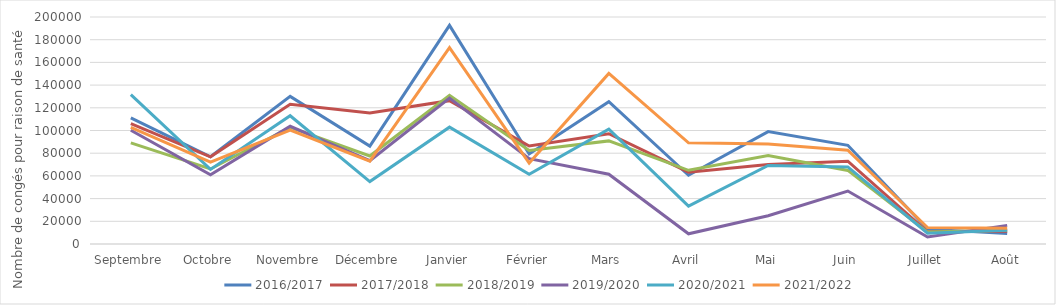
| Category | 2016/2017 | 2017/2018 | 2018/2019 | 2019/2020 | 2020/2021 | 2021/2022 |
|---|---|---|---|---|---|---|
| Septembre | 111199 | 106146 | 89077 | 100266 | 131608 | 102759 |
| Octobre | 76849 | 76831 | 66102 | 60899 | 65692 | 72157 |
| Novembre | 130060 | 123075 | 102812 | 103746 | 113022 | 100324 |
| Décembre | 86249 | 115398 | 77538 | 73438 | 55038 | 73012 |
| Janvier | 192656 | 126299 | 131051 | 128602 | 102952 | 173086 |
| Février | 79312 | 86326 | 82358 | 75176 | 61387 | 71261 |
| Mars | 125334 | 97158 | 90846 | 61443 | 101126 | 150284 |
| Avril | 60574 | 63251 | 64930 | 8985 | 33427 | 89103 |
| Mai | 99057 | 69996 | 77978 | 24921 | 69170 | 88069 |
| Juin | 86987 | 72936 | 64814 | 46677 | 67890 | 82592 |
| Juillet | 13085 | 10753 | 10510 | 6132 | 9448 | 14487 |
| Août | 9313 | 11125 | 12143 | 16415 | 12071 | 13923 |